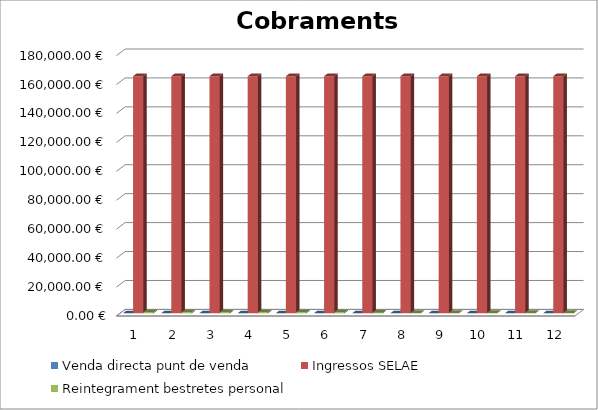
| Category | Venda directa punt de venda | Ingressos SELAE | Reintegrament bestretes personal |
|---|---|---|---|
| 0 | 0 | 163913.84 | 728.75 |
| 1 | 0 | 163913.84 | 728.75 |
| 2 | 0 | 163913.84 | 728.75 |
| 3 | 0 | 163913.84 | 728.75 |
| 4 | 0 | 163913.84 | 728.75 |
| 5 | 0 | 163913.84 | 728.75 |
| 6 | 0 | 163913.84 | 461.75 |
| 7 | 0 | 163913.84 | 295 |
| 8 | 0 | 163913.84 | 295 |
| 9 | 0 | 163913.84 | 295 |
| 10 | 0 | 163913.84 | 295 |
| 11 | 0 | 163913.84 | 295 |